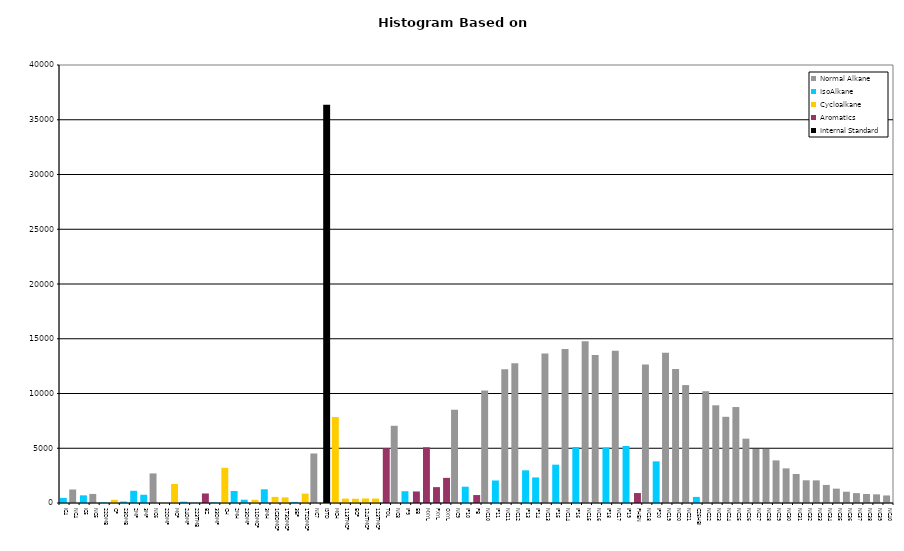
| Category | Normal Alkane | IsoAlkane | Cycloalkane | Aromatics | Internal Standard |
|---|---|---|---|---|---|
| IC4 | 0 | 469 | 0 | 0 | 0 |
| NC4 | 1233 | 0 | 0 | 0 | 0 |
| IC5 | 0 | 699 | 0 | 0 | 0 |
| NC5 | 828 | 0 | 0 | 0 | 0 |
| 22DMB | 0 | 56 | 0 | 0 | 0 |
| CP | 0 | 0 | 291 | 0 | 0 |
| 23DMB | 0 | 135 | 0 | 0 | 0 |
| 2MP | 0 | 1114 | 0 | 0 | 0 |
| 3MP | 0 | 754 | 0 | 0 | 0 |
| NC6 | 2700 | 0 | 0 | 0 | 0 |
| 22DMP | 0 | 0 | 0 | 0 | 0 |
| MCP | 0 | 0 | 1734 | 0 | 0 |
| 24DMP | 0 | 121 | 0 | 0 | 0 |
| 223TMB | 0 | 26 | 0 | 0 | 0 |
| BZ | 0 | 0 | 0 | 870 | 0 |
| 33DMP | 0 | 62 | 0 | 0 | 0 |
| CH | 0 | 0 | 3212 | 0 | 0 |
| 2MH | 0 | 1097 | 0 | 0 | 0 |
| 23DMP | 0 | 302 | 0 | 0 | 0 |
| 11DMCP | 0 | 0 | 295 | 0 | 0 |
| 3MH | 0 | 1252 | 0 | 0 | 0 |
| 1C3DMCP | 0 | 0 | 558 | 0 | 0 |
| 1T3DMCP | 0 | 0 | 514 | 0 | 0 |
| 3EP | 0 | 98 | 0 | 0 | 0 |
| 1T2DMCP | 0 | 0 | 858 | 0 | 0 |
| NC7 | 4522 | 0 | 0 | 0 | 0 |
| ISTD | 0 | 0 | 0 | 0 | 36366 |
| MCH | 0 | 0 | 7849 | 0 | 0 |
| 113TMCP | 0 | 0 | 402 | 0 | 0 |
| ECP | 0 | 0 | 388 | 0 | 0 |
| 124TMCP | 0 | 0 | 415 | 0 | 0 |
| 123TMCP | 0 | 0 | 408 | 0 | 0 |
| TOL | 0 | 0 | 0 | 4993 | 0 |
| NC8 | 7051 | 0 | 0 | 0 | 0 |
| IP9 | 0 | 1076 | 0 | 0 | 0 |
| EB | 0 | 0 | 0 | 1054 | 0 |
| MXYL | 0 | 0 | 0 | 5089 | 0 |
| PXYL | 0 | 0 | 0 | 1450 | 0 |
| OXYL | 0 | 0 | 0 | 2295 | 0 |
| NC9 | 8519 | 0 | 0 | 0 | 0 |
| IP10 | 0 | 1487 | 0 | 0 | 0 |
| PB | 0 | 0 | 0 | 727 | 0 |
| NC10 | 10271 | 0 | 0 | 0 | 0 |
| IP11 | 0 | 2056 | 0 | 0 | 0 |
| NC11 | 12226 | 0 | 0 | 0 | 0 |
| NC12 | 12770 | 0 | 0 | 0 | 0 |
| IP13 | 0 | 2985 | 0 | 0 | 0 |
| IP14 | 0 | 2334 | 0 | 0 | 0 |
| NC13 | 13647 | 0 | 0 | 0 | 0 |
| IP15 | 0 | 3501 | 0 | 0 | 0 |
| NC14 | 14070 | 0 | 0 | 0 | 0 |
| IP16 | 0 | 5115 | 0 | 0 | 0 |
| NC15 | 14767 | 0 | 0 | 0 | 0 |
| NC16 | 13514 | 0 | 0 | 0 | 0 |
| IP18 | 0 | 5071 | 0 | 0 | 0 |
| NC17 | 13915 | 0 | 0 | 0 | 0 |
| IP19 | 0 | 5203 | 0 | 0 | 0 |
| PHEN | 0 | 0 | 0 | 910 | 0 |
| NC18 | 12659 | 0 | 0 | 0 | 0 |
| IP20 | 0 | 3805 | 0 | 0 | 0 |
| NC19 | 13731 | 0 | 0 | 0 | 0 |
| NC20 | 12238 | 0 | 0 | 0 | 0 |
| NC21 | 10769 | 0 | 0 | 0 | 0 |
| C25HBI | 0 | 557 | 0 | 0 | 0 |
| NC22 | 10211 | 0 | 0 | 0 | 0 |
| NC23 | 8923 | 0 | 0 | 0 | 0 |
| NC24 | 7872 | 0 | 0 | 0 | 0 |
| NC25 | 8764 | 0 | 0 | 0 | 0 |
| NC26 | 5875 | 0 | 0 | 0 | 0 |
| NC27 | 4929 | 0 | 0 | 0 | 0 |
| NC28 | 4939 | 0 | 0 | 0 | 0 |
| NC29 | 3892 | 0 | 0 | 0 | 0 |
| NC30 | 3163 | 0 | 0 | 0 | 0 |
| NC31 | 2650 | 0 | 0 | 0 | 0 |
| NC32 | 2073 | 0 | 0 | 0 | 0 |
| NC33 | 2067 | 0 | 0 | 0 | 0 |
| NC34 | 1651 | 0 | 0 | 0 | 0 |
| NC35 | 1311 | 0 | 0 | 0 | 0 |
| NC36 | 1031 | 0 | 0 | 0 | 0 |
| NC37 | 901 | 0 | 0 | 0 | 0 |
| NC38 | 820 | 0 | 0 | 0 | 0 |
| NC39 | 789 | 0 | 0 | 0 | 0 |
| NC40 | 690 | 0 | 0 | 0 | 0 |